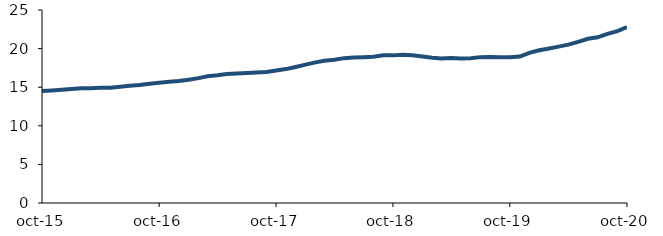
| Category | Series 0 |
|---|---|
| 2015-10-01 | 14.496 |
| 2015-11-01 | 14.573 |
| 2015-12-01 | 14.669 |
| 2016-01-01 | 14.766 |
| 2016-02-01 | 14.879 |
| 2016-03-01 | 14.849 |
| 2016-04-01 | 14.939 |
| 2016-05-01 | 14.93 |
| 2016-06-01 | 15.066 |
| 2016-07-01 | 15.186 |
| 2016-08-01 | 15.293 |
| 2016-09-01 | 15.449 |
| 2016-10-01 | 15.566 |
| 2016-11-01 | 15.698 |
| 2016-12-01 | 15.796 |
| 2017-01-01 | 15.974 |
| 2017-02-01 | 16.176 |
| 2017-03-01 | 16.42 |
| 2017-04-01 | 16.537 |
| 2017-05-01 | 16.695 |
| 2017-06-01 | 16.777 |
| 2017-07-01 | 16.841 |
| 2017-08-01 | 16.91 |
| 2017-09-01 | 16.98 |
| 2017-10-01 | 17.174 |
| 2017-11-01 | 17.344 |
| 2017-12-01 | 17.621 |
| 2018-01-01 | 17.918 |
| 2018-02-01 | 18.22 |
| 2018-03-01 | 18.431 |
| 2018-04-01 | 18.559 |
| 2018-05-01 | 18.766 |
| 2018-06-01 | 18.833 |
| 2018-07-01 | 18.886 |
| 2018-08-01 | 18.959 |
| 2018-09-01 | 19.129 |
| 2018-10-01 | 19.123 |
| 2018-11-01 | 19.192 |
| 2018-12-01 | 19.134 |
| 2019-01-01 | 18.969 |
| 2019-02-01 | 18.815 |
| 2019-03-01 | 18.715 |
| 2019-04-01 | 18.791 |
| 2019-05-01 | 18.716 |
| 2019-06-01 | 18.759 |
| 2019-07-01 | 18.895 |
| 2019-08-01 | 18.921 |
| 2019-09-01 | 18.895 |
| 2019-10-01 | 18.877 |
| 2019-11-01 | 18.972 |
| 2019-12-01 | 19.458 |
| 2020-01-01 | 19.787 |
| 2020-02-01 | 20.024 |
| 2020-03-01 | 20.256 |
| 2020-04-01 | 20.52 |
| 2020-05-01 | 20.881 |
| 2020-06-01 | 21.276 |
| 2020-07-01 | 21.457 |
| 2020-08-01 | 21.909 |
| 2020-09-01 | 22.261 |
| 2020-10-01 | 22.798 |